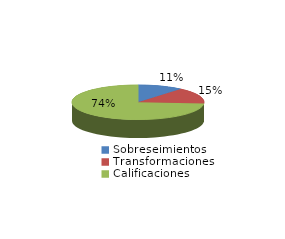
| Category | Series 0 |
|---|---|
| Sobreseimientos | 29 |
| Transformaciones | 39 |
| Calificaciones | 191 |